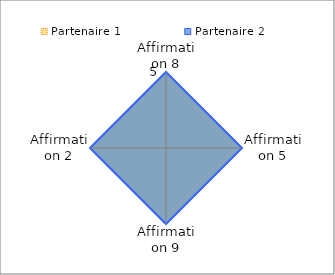
| Category | Partenaire 1 | Partenaire 2 |
|---|---|---|
| Affirmation 8 | 5 | 5 |
| Affirmation 5 | 5 | 5 |
| Affirmation 9 | 5 | 5 |
| Affirmation 2 | 5 | 5 |